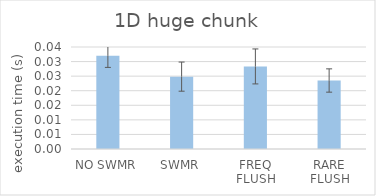
| Category | 1D hg chunk |
|---|---|
| NO SWMR | 0.032 |
| SWMR | 0.025 |
| FREQ FLUSH | 0.028 |
| RARE FLUSH | 0.024 |